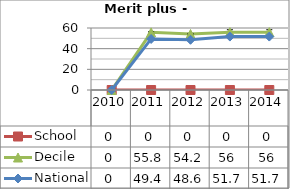
| Category | School  | Decile | National |
|---|---|---|---|
| 2010.0 | 0 | 0 | 0 |
| 2011.0 | 0 | 55.8 | 49.4 |
| 2012.0 | 0 | 54.2 | 48.6 |
| 2013.0 | 0 | 56 | 51.7 |
| 2014.0 | 0 | 56 | 51.7 |